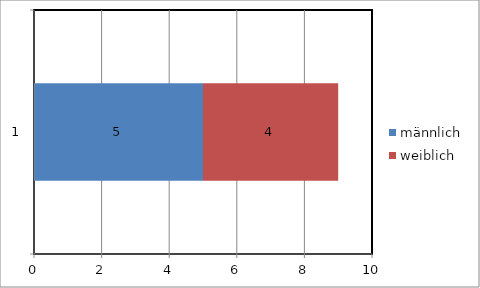
| Category | männlich | weiblich |
|---|---|---|
| 0 | 5 | 4 |